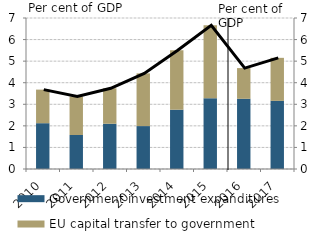
| Category | Government investment expanditures | EU capital transfer to government |
|---|---|---|
| 2010.0 | 2.123 | 1.557 |
| 2011.0 | 1.576 | 1.786 |
| 2012.0 | 2.098 | 1.645 |
| 2013.0 | 1.99 | 2.443 |
| 2014.0 | 2.749 | 2.755 |
| 2015.0 | 3.283 | 3.377 |
| 2016.0 | 3.255 | 1.423 |
| 2017.0 | 3.159 | 1.995 |